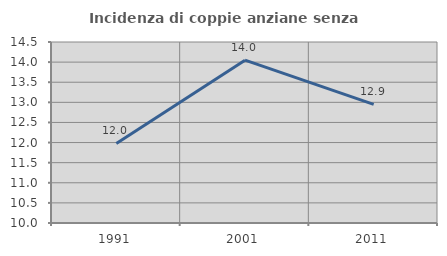
| Category | Incidenza di coppie anziane senza figli  |
|---|---|
| 1991.0 | 11.979 |
| 2001.0 | 14.049 |
| 2011.0 | 12.95 |